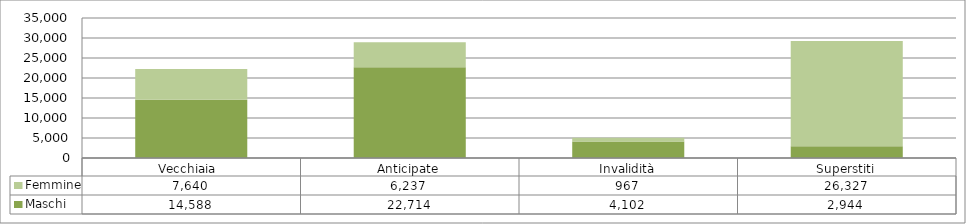
| Category | Maschi | Femmine |
|---|---|---|
| Vecchiaia  | 14588 | 7640 |
| Anticipate | 22714 | 6237 |
| Invalidità | 4102 | 967 |
| Superstiti | 2944 | 26327 |